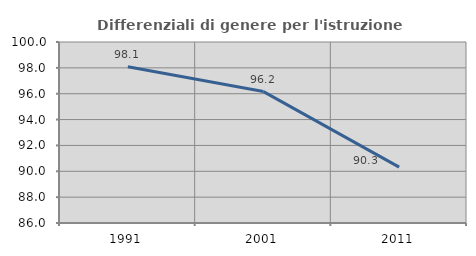
| Category | Differenziali di genere per l'istruzione superiore |
|---|---|
| 1991.0 | 98.091 |
| 2001.0 | 96.166 |
| 2011.0 | 90.323 |